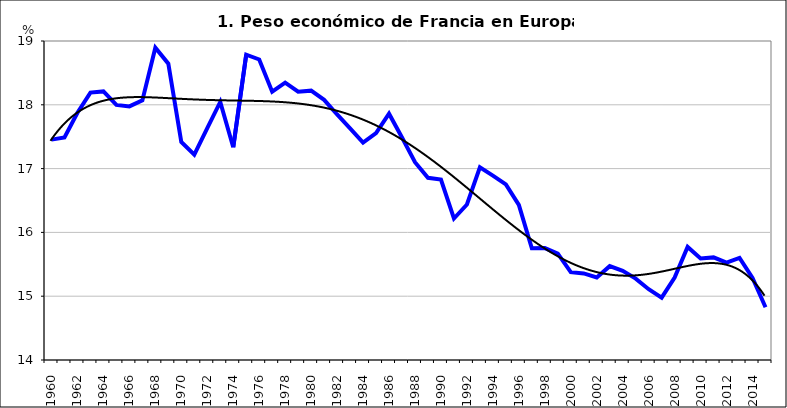
| Category | Series 0 |
|---|---|
| 1960 | 17.455 |
| 1961 | 17.489 |
| 1962 | 17.876 |
| 1963 | 18.191 |
| 1964 | 18.209 |
| 1965 | 17.999 |
| 1966 | 17.975 |
| 1967 | 18.069 |
| 1968 | 18.895 |
| 1969 | 18.644 |
| 1970 | 17.416 |
| 1971 | 17.217 |
| 1972 | 17.636 |
| 1973 | 18.044 |
| 1974 | 17.335 |
| 1975 | 18.786 |
| 1976 | 18.711 |
| 1977 | 18.206 |
| 1978 | 18.348 |
| 1979 | 18.206 |
| 1980 | 18.222 |
| 1981 | 18.078 |
| 1982 | 17.848 |
| 1983 | 17.63 |
| 1984 | 17.407 |
| 1985 | 17.556 |
| 1986 | 17.861 |
| 1987 | 17.488 |
| 1988 | 17.1 |
| 1989 | 16.856 |
| 1990 | 16.828 |
| 1991 | 16.218 |
| 1992 | 16.437 |
| 1993 | 17.02 |
| 1994 | 16.89 |
| 1995 | 16.751 |
| 1996 | 16.431 |
| 1997 | 15.752 |
| 1998 | 15.754 |
| 1999 | 15.666 |
| 2000 | 15.377 |
| 2001 | 15.357 |
| 2002 | 15.293 |
| 2003 | 15.471 |
| 2004 | 15.397 |
| 2005 | 15.276 |
| 2006 | 15.109 |
| 2007 | 14.978 |
| 2008 | 15.292 |
| 2009 | 15.772 |
| 2010 | 15.59 |
| 2011 | 15.608 |
| 2012 | 15.525 |
| 2013 | 15.601 |
| 2014 | 15.285 |
| 2015 | 14.826 |